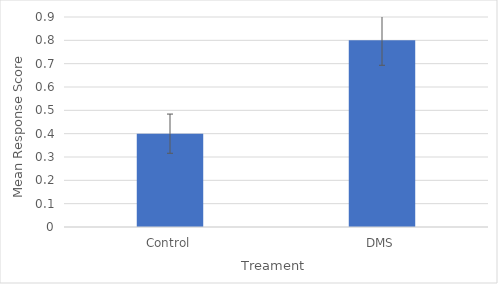
| Category | Series 0 |
|---|---|
| Control | 0.4 |
| DMS | 0.8 |